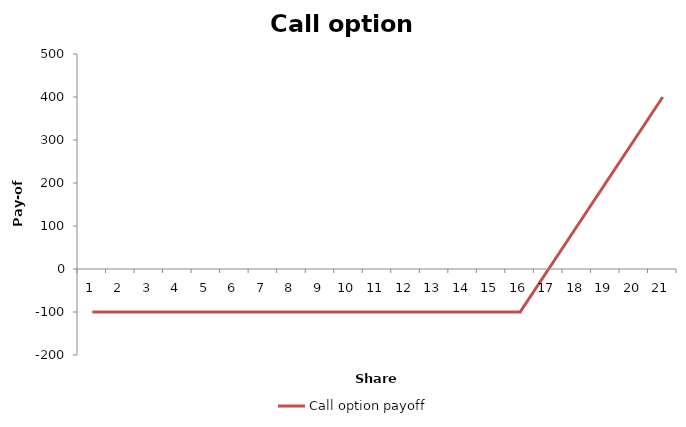
| Category | Call option payoff |
|---|---|
| 0 | -100 |
| 1 | -100 |
| 2 | -100 |
| 3 | -100 |
| 4 | -100 |
| 5 | -100 |
| 6 | -100 |
| 7 | -100 |
| 8 | -100 |
| 9 | -100 |
| 10 | -100 |
| 11 | -100 |
| 12 | -100 |
| 13 | -100 |
| 14 | -100 |
| 15 | -100 |
| 16 | 0 |
| 17 | 100 |
| 18 | 200 |
| 19 | 300 |
| 20 | 400 |